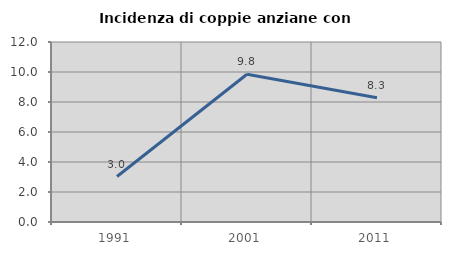
| Category | Incidenza di coppie anziane con figli |
|---|---|
| 1991.0 | 3.03 |
| 2001.0 | 9.848 |
| 2011.0 | 8.28 |